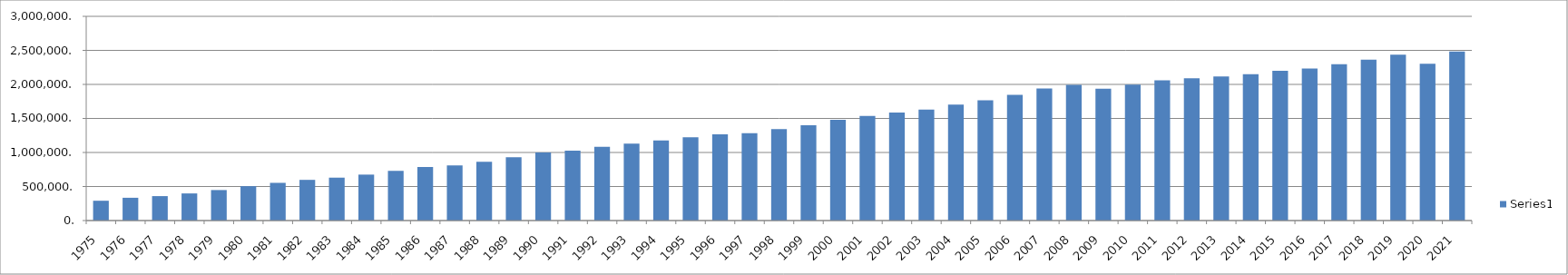
| Category | Series 0 |
|---|---|
| 1975 | 290877.3 |
| 1976 | 334567.3 |
| 1977 | 358989.4 |
| 1978 | 398402.6 |
| 1979 | 448057.1 |
| 1980 | 504930.7 |
| 1981 | 553861.4 |
| 1982 | 597688.1 |
| 1983 | 630219.6 |
| 1984 | 674919.2 |
| 1985 | 731434.2 |
| 1986 | 785821.3 |
| 1987 | 810332.9 |
| 1988 | 862511.7 |
| 1989 | 931207.9 |
| 1990 | 999521.7 |
| 1991 | 1026930.1 |
| 1992 | 1083285.9 |
| 1993 | 1129359.6 |
| 1994 | 1175736.5 |
| 1995 | 1224717.2 |
| 1996 | 1265105.4 |
| 1997 | 1282409.5 |
| 1998 | 1343327.3 |
| 1999 | 1400999 |
| 2000 | 1478585 |
| 2001 | 1538200 |
| 2002 | 1587829 |
| 2003 | 1630666 |
| 2004 | 1704019 |
| 2005 | 1765905 |
| 2006 | 1848151 |
| 2007 | 1941360 |
| 2008 | 1992380 |
| 2009 | 1936422 |
| 2010 | 1995289 |
| 2011 | 2058369 |
| 2012 | 2088804 |
| 2013 | 2117189 |
| 2014 | 2149765 |
| 2015 | 2198432 |
| 2016 | 2234129 |
| 2017 | 2297242 |
| 2018 | 2363306 |
| 2019 | 2437635 |
| 2020 | 2302860 |
| 2021 | 2483616 |